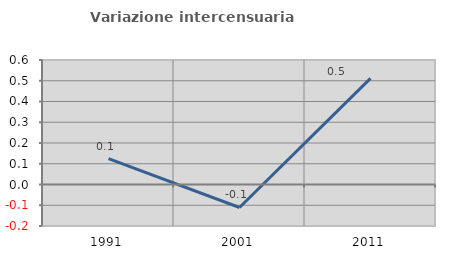
| Category | Variazione intercensuaria annua |
|---|---|
| 1991.0 | 0.124 |
| 2001.0 | -0.111 |
| 2011.0 | 0.512 |